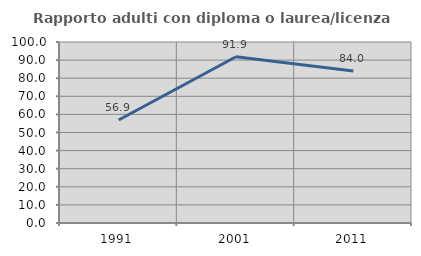
| Category | Rapporto adulti con diploma o laurea/licenza media  |
|---|---|
| 1991.0 | 56.886 |
| 2001.0 | 91.866 |
| 2011.0 | 83.958 |